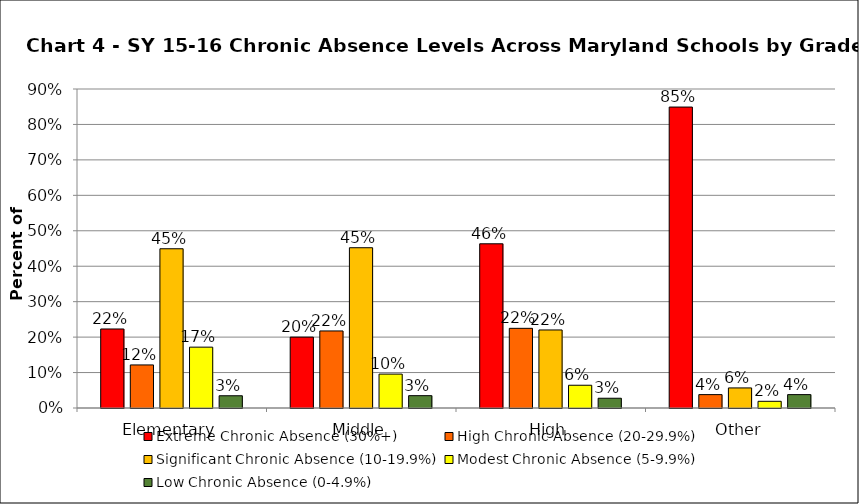
| Category | Extreme Chronic Absence (30%+) | High Chronic Absence (20-29.9%) | Significant Chronic Absence (10-19.9%) | Modest Chronic Absence (5-9.9%) | Low Chronic Absence (0-4.9%) |
|---|---|---|---|---|---|
| 0 | 0.223 | 0.122 | 0.449 | 0.172 | 0.035 |
| 1 | 0.2 | 0.217 | 0.452 | 0.096 | 0.035 |
| 2 | 0.463 | 0.225 | 0.22 | 0.064 | 0.028 |
| 3 | 0.849 | 0.038 | 0.057 | 0.019 | 0.038 |